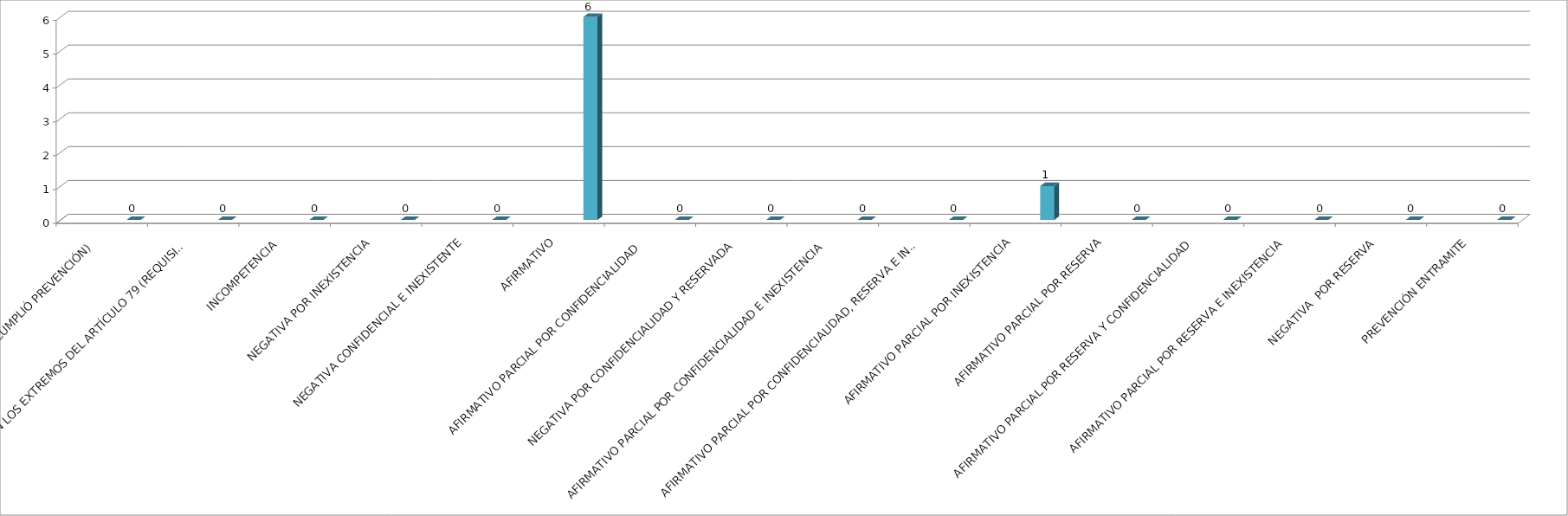
| Category | Series 0 | Series 1 | Series 2 | Series 3 | Series 4 |
|---|---|---|---|---|---|
| SE TIENE POR NO PRESENTADA ( NO CUMPLIÓ PREVENCIÓN) |  |  |  |  | 0 |
| NO CUMPLIO CON LOS EXTREMOS DEL ARTÍCULO 79 (REQUISITOS) |  |  |  |  | 0 |
| INCOMPETENCIA  |  |  |  |  | 0 |
| NEGATIVA POR INEXISTENCIA |  |  |  |  | 0 |
| NEGATIVA CONFIDENCIAL E INEXISTENTE |  |  |  |  | 0 |
| AFIRMATIVO |  |  |  |  | 6 |
| AFIRMATIVO PARCIAL POR CONFIDENCIALIDAD  |  |  |  |  | 0 |
| NEGATIVA POR CONFIDENCIALIDAD Y RESERVADA |  |  |  |  | 0 |
| AFIRMATIVO PARCIAL POR CONFIDENCIALIDAD E INEXISTENCIA |  |  |  |  | 0 |
| AFIRMATIVO PARCIAL POR CONFIDENCIALIDAD, RESERVA E INEXISTENCIA |  |  |  |  | 0 |
| AFIRMATIVO PARCIAL POR INEXISTENCIA |  |  |  |  | 1 |
| AFIRMATIVO PARCIAL POR RESERVA |  |  |  |  | 0 |
| AFIRMATIVO PARCIAL POR RESERVA Y CONFIDENCIALIDAD |  |  |  |  | 0 |
| AFIRMATIVO PARCIAL POR RESERVA E INEXISTENCIA |  |  |  |  | 0 |
| NEGATIVA  POR RESERVA |  |  |  |  | 0 |
| PREVENCIÓN ENTRAMITE |  |  |  |  | 0 |